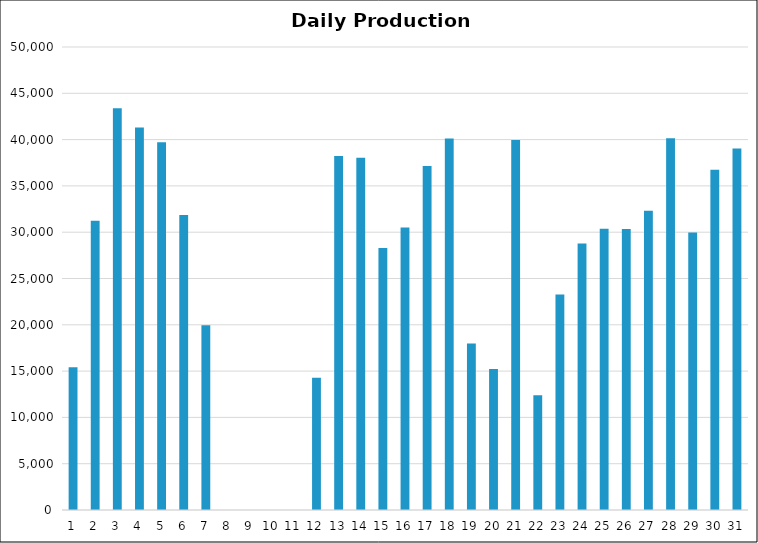
| Category | Series 0 |
|---|---|
| 0 | 15410.08 |
| 1 | 31223.243 |
| 2 | 43398.325 |
| 3 | 41317.707 |
| 4 | 39706.656 |
| 5 | 31852.192 |
| 6 | 19963.851 |
| 7 | 0 |
| 8 | 0 |
| 9 | 0 |
| 10 | 0 |
| 11 | 14280.117 |
| 12 | 38234.155 |
| 13 | 38047.157 |
| 14 | 28301.675 |
| 15 | 30508.875 |
| 16 | 37137.717 |
| 17 | 40117.568 |
| 18 | 17984.672 |
| 19 | 15238.411 |
| 20 | 39964.384 |
| 21 | 12395.776 |
| 22 | 23279.936 |
| 23 | 28774.016 |
| 24 | 30367.797 |
| 25 | 30343.445 |
| 26 | 32324.875 |
| 27 | 40149.088 |
| 28 | 29974.411 |
| 29 | 36751.029 |
| 30 | 39049.76 |